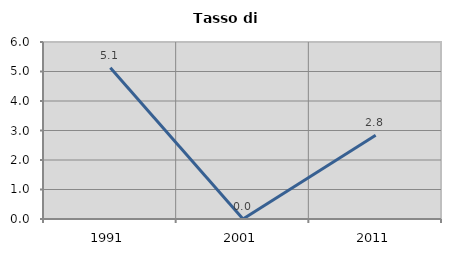
| Category | Tasso di disoccupazione   |
|---|---|
| 1991.0 | 5.128 |
| 2001.0 | 0 |
| 2011.0 | 2.837 |